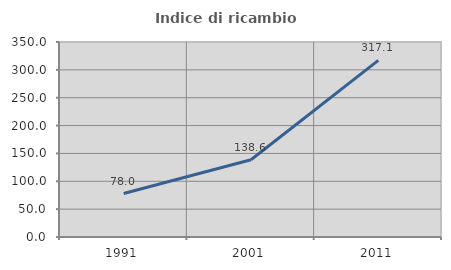
| Category | Indice di ricambio occupazionale  |
|---|---|
| 1991.0 | 77.976 |
| 2001.0 | 138.599 |
| 2011.0 | 317.066 |